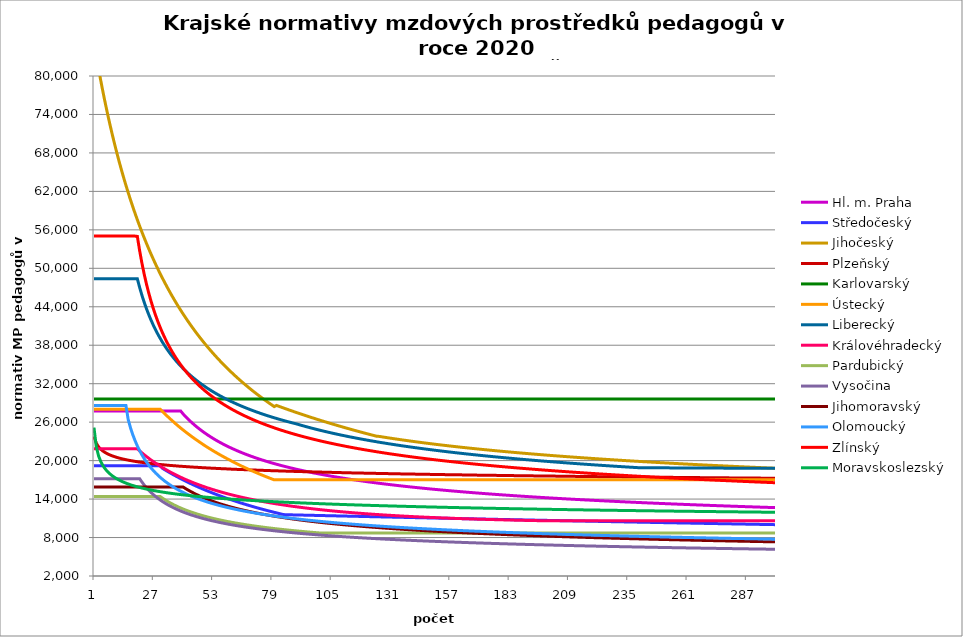
| Category | Hl. m. Praha | Středočeský | Jihočeský | Plzeňský | Karlovarský  | Ústecký   | Liberecký | Královéhradecký | Pardubický | Vysočina | Jihomoravský | Olomoucký | Zlínský | Moravskoslezský |
|---|---|---|---|---|---|---|---|---|---|---|---|---|---|---|
| 0 | 27744.282 | 19215.36 | 85227.218 | 23750.715 | 29600 | 28017.204 | 48369.677 | 21844.533 | 14402.751 | 17187.474 | 15895.855 | 28605.175 | 55022.513 | 25157.647 |
| 1 | 27744.282 | 19215.36 | 83125.411 | 22715.459 | 29600 | 28017.204 | 48369.677 | 21844.533 | 14402.751 | 17187.474 | 15895.855 | 28605.175 | 55022.513 | 22174.645 |
| 2 | 27744.282 | 19215.36 | 81124.775 | 22143.083 | 29600 | 28017.204 | 48369.677 | 21844.533 | 14402.751 | 17187.474 | 15895.855 | 28605.175 | 55022.513 | 20736.363 |
| 3 | 27744.282 | 19215.36 | 79218.177 | 21756.117 | 29600 | 28017.204 | 48369.677 | 21844.533 | 14402.751 | 17187.474 | 15895.855 | 28605.175 | 55022.513 | 19824.06 |
| 4 | 27744.282 | 19215.36 | 77399.139 | 21464.368 | 29600 | 28017.204 | 48369.677 | 21844.533 | 14402.751 | 17187.474 | 15895.855 | 28605.175 | 55022.513 | 19169.879 |
| 5 | 27744.282 | 19215.36 | 75661.764 | 21240.569 | 29600 | 28017.204 | 48369.677 | 21844.533 | 14402.751 | 17187.474 | 15895.855 | 28605.175 | 55022.513 | 18666.583 |
| 6 | 27744.282 | 19215.36 | 74000.675 | 21041.127 | 29600 | 28017.204 | 48369.677 | 21844.533 | 14402.751 | 17187.474 | 15895.855 | 28605.175 | 55022.513 | 18261.223 |
| 7 | 27744.282 | 19215.36 | 72410.955 | 20884.25 | 29600 | 28017.204 | 48369.677 | 21844.533 | 14402.751 | 17187.474 | 15895.855 | 28605.175 | 55022.513 | 17924.051 |
| 8 | 27744.282 | 19215.36 | 70888.1 | 20739.287 | 29600 | 28017.204 | 48369.677 | 21844.533 | 14402.751 | 17187.474 | 15895.855 | 28605.175 | 55022.513 | 17636.814 |
| 9 | 27744.282 | 19215.36 | 69427.98 | 20615.271 | 29600 | 28017.204 | 48369.677 | 21844.533 | 14402.751 | 17187.474 | 15895.855 | 28605.175 | 55022.513 | 17387.563 |
| 10 | 27744.282 | 19215.36 | 68026.795 | 20502.104 | 29600 | 28017.204 | 48369.677 | 21844.533 | 14402.751 | 17187.474 | 15895.855 | 28605.175 | 55022.513 | 17168.08 |
| 11 | 27744.282 | 19215.36 | 66681.049 | 20399.454 | 29600 | 28017.204 | 48369.677 | 21844.533 | 14402.751 | 17187.474 | 15895.855 | 28605.175 | 55022.513 | 16972.491 |
| 12 | 27744.282 | 19215.36 | 65387.514 | 20307.023 | 29600 | 28017.204 | 48369.677 | 21844.533 | 14402.751 | 17187.474 | 15895.855 | 28605.175 | 55022.513 | 16796.461 |
| 13 | 27744.282 | 19215.36 | 64143.211 | 20224.549 | 29600 | 28017.204 | 48369.677 | 21844.533 | 14402.751 | 17187.474 | 15895.855 | 28605.175 | 55022.513 | 16636.707 |
| 14 | 27744.282 | 19215.36 | 62945.38 | 20142.742 | 29600 | 28017.204 | 48369.677 | 21844.533 | 14402.751 | 17187.474 | 15895.855 | 28605.175 | 55022.513 | 16490.687 |
| 15 | 27744.282 | 19215.36 | 61791.467 | 20070.578 | 29600 | 28017.204 | 48369.677 | 21844.533 | 14402.751 | 17187.474 | 15895.855 | 26386.396 | 55022.513 | 16356.396 |
| 16 | 27744.282 | 19215.36 | 60679.099 | 20007.857 | 29600 | 28017.204 | 48369.677 | 21844.533 | 14402.751 | 17187.474 | 15895.855 | 25127.045 | 55022.513 | 16232.226 |
| 17 | 27744.282 | 19215.36 | 59606.073 | 19945.527 | 29600 | 28017.204 | 48369.677 | 21844.533 | 14402.751 | 17187.474 | 15895.855 | 24047.635 | 55022.513 | 16116.87 |
| 18 | 27744.282 | 19215.36 | 58570.337 | 19883.585 | 29600 | 28017.204 | 48369.677 | 21844.533 | 14402.751 | 17187.474 | 15895.855 | 23117.407 | 55022.513 | 16009.252 |
| 19 | 27744.282 | 19215.36 | 57569.981 | 19822.026 | 29600 | 28017.204 | 48369.677 | 21844.533 | 14402.751 | 17187.474 | 15895.855 | 22290.121 | 54979.248 | 15908.475 |
| 20 | 27744.282 | 19215.36 | 56603.222 | 19769.563 | 29600 | 28017.204 | 47024.575 | 21523.604 | 14402.751 | 17187.474 | 15895.855 | 21561.97 | 52770.921 | 15813.786 |
| 21 | 27744.282 | 19215.36 | 55668.396 | 19726.056 | 29600 | 28017.204 | 45809.931 | 21211.969 | 14402.751 | 16666.811 | 15895.855 | 20909.504 | 50824.463 | 15724.547 |
| 22 | 27744.282 | 19215.36 | 54763.947 | 19674.1 | 29600 | 28017.204 | 44706.502 | 20919.181 | 14402.751 | 16198.337 | 15895.855 | 20323.346 | 49094.133 | 15640.211 |
| 23 | 27744.282 | 19215.36 | 53888.417 | 19631.012 | 29600 | 28017.204 | 43698.731 | 20634.366 | 14402.751 | 15773.783 | 15895.855 | 19786.846 | 47544.374 | 15560.309 |
| 24 | 27744.282 | 19215.36 | 53040.442 | 19588.112 | 29600 | 28017.204 | 42773.89 | 20366.636 | 14402.751 | 15386.8 | 15895.855 | 19303.186 | 46147.119 | 15484.432 |
| 25 | 27744.282 | 19215.36 | 52218.74 | 19545.399 | 29600 | 28017.204 | 41921.467 | 20096.571 | 14402.751 | 15032.044 | 15895.855 | 18858.678 | 44879.906 | 15412.226 |
| 26 | 27744.282 | 19215.36 | 51422.109 | 19502.872 | 29600 | 28017.204 | 41132.69 | 19851.491 | 14402.751 | 14705.916 | 15895.855 | 18449.562 | 43724.538 | 15343.377 |
| 27 | 27744.282 | 19215.36 | 50649.419 | 19468.983 | 29600 | 28017.204 | 40400.185 | 19603.568 | 14402.751 | 14405.318 | 15895.855 | 18072.579 | 42666.111 | 15277.613 |
| 28 | 27744.282 | 19215.36 | 49899.607 | 19426.788 | 29600 | 28017.204 | 39717.702 | 19370.295 | 14402.751 | 14125.834 | 15895.855 | 17724.89 | 41692.296 | 15214.688 |
| 29 | 27744.282 | 19215.36 | 49171.672 | 19393.163 | 29600 | 28017.204 | 39079.905 | 19142.509 | 14402.751 | 13866.563 | 15895.855 | 17397.168 | 40792.806 | 15154.387 |
| 30 | 27744.282 | 18801.722 | 48464.669 | 19359.654 | 29600 | 27660.297 | 38482.213 | 18920.017 | 14151.855 | 13624.675 | 15895.855 | 17094.55 | 39958.981 | 15096.517 |
| 31 | 27744.282 | 18583.52 | 47777.709 | 19326.261 | 29600 | 27312.369 | 37920.665 | 18710.6 | 13916.665 | 13398.079 | 15895.855 | 16808.666 | 39183.482 | 15040.904 |
| 32 | 27744.282 | 18370.325 | 47109.952 | 19292.983 | 29600 | 26973.085 | 37391.82 | 18505.768 | 13696.055 | 13185.672 | 15895.855 | 16544.557 | 38460.044 | 14987.392 |
| 33 | 27744.282 | 18161.966 | 46460.602 | 19259.82 | 29600 | 26642.127 | 36892.673 | 18305.373 | 13488.614 | 12985.737 | 15895.855 | 16294.62 | 37783.285 | 14935.84 |
| 34 | 27744.282 | 17958.28 | 45828.911 | 19235.021 | 29600 | 26319.192 | 36420.584 | 18116.735 | 13293.113 | 12797.804 | 15895.855 | 16057.952 | 37148.552 | 14886.121 |
| 35 | 27744.282 | 17759.113 | 45214.166 | 19202.057 | 29600 | 26003.992 | 35973.23 | 17931.946 | 13108.474 | 12620.062 | 15895.855 | 15833.727 | 36551.807 | 14838.118 |
| 36 | 27744.282 | 17564.314 | 44615.695 | 19177.407 | 29600 | 25679.369 | 35548.551 | 17750.889 | 12933.749 | 12451.89 | 15895.855 | 15621.194 | 35989.522 | 14791.728 |
| 37 | 27744.282 | 17373.743 | 44032.86 | 19144.639 | 29600 | 25379.221 | 35144.719 | 17573.451 | 12768.099 | 12292.395 | 15895.855 | 15419.665 | 35458.601 | 14746.852 |
| 38 | 27744.282 | 17187.263 | 43465.057 | 19120.137 | 29600 | 25086.008 | 34760.101 | 17406.416 | 12610.782 | 12141.084 | 15895.855 | 15233.758 | 34956.318 | 14703.402 |
| 39 | 27304.519 | 17004.743 | 42911.711 | 19095.697 | 29600 | 24799.492 | 34393.237 | 17242.526 | 12461.135 | 11996.881 | 15895.855 | 15052.28 | 34480.26 | 14661.299 |
| 40 | 26923.089 | 16826.06 | 42372.277 | 19071.319 | 29600 | 24519.448 | 34042.815 | 17081.695 | 12318.564 | 11859.719 | 15673.769 | 14880.081 | 34028.284 | 14620.467 |
| 41 | 26560.987 | 16651.092 | 41846.236 | 19047.004 | 29600 | 24245.658 | 33707.656 | 16930.354 | 12182.54 | 11728.638 | 15457.802 | 14716.672 | 33598.48 | 14580.837 |
| 42 | 26216.684 | 16479.726 | 41333.097 | 19022.75 | 29600 | 23977.914 | 33386.691 | 16781.672 | 12052.585 | 11603.338 | 15258.075 | 14556.814 | 33189.14 | 14542.347 |
| 43 | 25888.809 | 16311.851 | 40832.39 | 18998.559 | 29600 | 23716.019 | 33078.953 | 16635.579 | 11928.268 | 11483.829 | 15063.444 | 14405.081 | 32798.73 | 14504.938 |
| 44 | 25576.133 | 16147.361 | 40343.669 | 18974.428 | 29600 | 23459.784 | 32783.567 | 16492.008 | 11809.199 | 11369.277 | 14878.647 | 14265.677 | 32425.871 | 14468.555 |
| 45 | 25277.551 | 15986.156 | 39866.509 | 18958.376 | 29600 | 23209.026 | 32499.731 | 16356.978 | 11695.023 | 11259.183 | 14703.145 | 14124.433 | 32069.318 | 14433.147 |
| 46 | 24992.062 | 15828.138 | 39400.504 | 18934.347 | 29600 | 22963.572 | 32226.717 | 16224.142 | 11585.421 | 11153.896 | 14536.443 | 13994.81 | 31727.942 | 14398.669 |
| 47 | 24718.762 | 15673.214 | 38945.267 | 18910.38 | 29600 | 22723.256 | 31963.858 | 16093.446 | 11480.098 | 11052.412 | 14373.479 | 13867.545 | 31400.72 | 14365.075 |
| 48 | 24456.829 | 15521.292 | 38500.43 | 18894.435 | 29600 | 22474.986 | 31710.543 | 15970.64 | 11378.786 | 10954.838 | 14218.631 | 13742.573 | 31086.723 | 14332.326 |
| 49 | 24205.518 | 15372.288 | 38065.64 | 18870.568 | 29600 | 22244.735 | 31466.21 | 15843.98 | 11281.241 | 10860.759 | 14071.496 | 13624.03 | 30785.101 | 14300.383 |
| 50 | 23964.145 | 15226.117 | 37640.561 | 18854.691 | 29600 | 22019.155 | 31230.342 | 15724.937 | 11187.236 | 10770.545 | 13931.698 | 13511.641 | 30495.079 | 14269.211 |
| 51 | 23732.089 | 15082.7 | 37224.87 | 18830.924 | 29600 | 21798.104 | 31002.463 | 15613.215 | 11096.567 | 10683.052 | 13794.651 | 13401.091 | 30215.947 | 14238.775 |
| 52 | 23508.779 | 14941.96 | 36818.261 | 18815.113 | 29600 | 21581.447 | 30782.133 | 15497.602 | 11009.041 | 10598.916 | 13664.434 | 13296.332 | 29947.053 | 14209.045 |
| 53 | 23293.691 | 14803.821 | 36420.438 | 18799.329 | 29600 | 21369.054 | 30568.945 | 15389.076 | 10924.483 | 10517.533 | 13536.652 | 13193.198 | 29687.797 | 14179.992 |
| 54 | 23086.344 | 14668.214 | 36031.121 | 18775.702 | 29600 | 21160.801 | 30362.522 | 15282.058 | 10842.731 | 10438.806 | 13415.247 | 13095.529 | 29437.627 | 14151.586 |
| 55 | 22886.295 | 14535.068 | 35650.039 | 18759.983 | 29600 | 20956.568 | 30162.513 | 15176.519 | 10763.634 | 10362.412 | 13296 | 12999.295 | 29196.035 | 14123.804 |
| 56 | 22693.133 | 14404.318 | 35276.933 | 18744.291 | 29600 | 20756.24 | 29968.593 | 15077.599 | 10687.052 | 10288.733 | 13182.726 | 12908.231 | 28962.549 | 14096.618 |
| 57 | 22506.48 | 14275.899 | 34911.557 | 18728.625 | 29600 | 20559.705 | 29780.46 | 14974.855 | 10612.857 | 10217.451 | 13075.175 | 12818.435 | 28736.733 | 14070.008 |
| 58 | 22325.987 | 14149.75 | 34553.671 | 18712.985 | 29600 | 20366.858 | 29597.83 | 14878.538 | 10540.927 | 10148.265 | 12969.364 | 12729.879 | 28518.183 | 14043.95 |
| 59 | 22151.328 | 14025.81 | 34203.049 | 18689.575 | 29600 | 20177.594 | 29420.441 | 14783.451 | 10471.15 | 10080.891 | 12865.252 | 12646.154 | 28306.522 | 14018.424 |
| 60 | 21982.2 | 13904.023 | 33859.47 | 18674 | 29600 | 19991.816 | 29248.046 | 14694.483 | 10403.422 | 10015.709 | 12766.43 | 12567.093 | 28101.403 | 13993.41 |
| 61 | 21818.324 | 13784.333 | 33522.726 | 18658.451 | 29600 | 19799.392 | 29080.414 | 14606.58 | 10337.645 | 9952.652 | 12672.691 | 12485.488 | 27902.499 | 13968.89 |
| 62 | 21659.438 | 13666.686 | 33192.614 | 18642.928 | 29600 | 19620.482 | 28917.329 | 14514.927 | 10273.727 | 9890.808 | 12576.794 | 12408.418 | 27709.507 | 13944.846 |
| 63 | 21505.297 | 13551.03 | 32868.94 | 18627.431 | 29600 | 19444.776 | 28758.59 | 14433.892 | 10211.582 | 9830.984 | 12489.285 | 12332.292 | 27522.144 | 13921.262 |
| 64 | 21355.675 | 13437.315 | 32551.517 | 18619.693 | 29600 | 19272.189 | 28604.004 | 14349.07 | 10151.132 | 9772.913 | 12399.558 | 12260.493 | 27340.145 | 13898.121 |
| 65 | 21210.358 | 13325.492 | 32240.167 | 18604.234 | 29600 | 19102.639 | 28453.394 | 14265.239 | 10092.299 | 9716.343 | 12314.49 | 12189.526 | 27163.261 | 13875.408 |
| 66 | 21069.147 | 13215.516 | 31934.716 | 18588.801 | 29600 | 18936.047 | 28306.592 | 14186.959 | 10035.015 | 9661.03 | 12230.581 | 12119.375 | 26991.261 | 13853.109 |
| 67 | 20931.854 | 13107.34 | 31634.999 | 18573.394 | 29600 | 18772.334 | 28163.438 | 14109.535 | 9979.211 | 9607.343 | 12151.097 | 12053.312 | 26823.926 | 13831.211 |
| 68 | 20798.305 | 13000.92 | 31340.855 | 18558.012 | 29600 | 18611.429 | 28023.784 | 14032.95 | 9924.826 | 9555.04 | 12072.639 | 11987.964 | 26661.051 | 13809.699 |
| 69 | 20668.334 | 12896.215 | 31052.131 | 18542.656 | 29600 | 18453.258 | 27887.488 | 13961.626 | 9871.8 | 9504.087 | 11998.396 | 11923.322 | 26502.443 | 13788.563 |
| 70 | 20541.788 | 12793.182 | 30768.678 | 18534.988 | 29600 | 18297.753 | 27754.417 | 13886.635 | 9820.078 | 9454.061 | 11921.892 | 11862.554 | 26347.922 | 13767.79 |
| 71 | 20418.519 | 12691.783 | 30490.353 | 18519.669 | 29600 | 18144.847 | 27624.444 | 13816.787 | 9769.608 | 9405.518 | 11849.485 | 11799.253 | 26197.316 | 13747.369 |
| 72 | 20298.391 | 12591.979 | 30217.018 | 18504.377 | 29600 | 17994.475 | 27497.451 | 13747.638 | 9720.339 | 9358.229 | 11781.045 | 11739.74 | 26050.465 | 13727.288 |
| 73 | 20181.275 | 12493.732 | 29948.541 | 18489.109 | 29600 | 17838.43 | 27373.325 | 13683.437 | 9672.225 | 9311.789 | 11710.334 | 11683.91 | 25907.215 | 13707.538 |
| 74 | 20067.047 | 12397.006 | 29684.792 | 18481.485 | 29600 | 17693.074 | 27251.958 | 13615.613 | 9625.222 | 9266.552 | 11643.487 | 11625.552 | 25767.424 | 13688.109 |
| 75 | 19955.593 | 12301.767 | 29425.648 | 18466.255 | 29600 | 17550.067 | 27133.249 | 13552.636 | 9579.286 | 9222.489 | 11580.387 | 11570.801 | 25630.955 | 13668.991 |
| 76 | 19846.803 | 12207.98 | 29170.99 | 18451.05 | 29600 | 17409.354 | 27017.101 | 13490.239 | 9534.379 | 9179.025 | 11515.012 | 11516.562 | 25497.681 | 13650.175 |
| 77 | 19740.574 | 12115.612 | 28920.701 | 18443.457 | 29600 | 17270.879 | 26903.423 | 13428.414 | 9490.463 | 9136.874 | 11453.292 | 11462.83 | 25367.478 | 13631.653 |
| 78 | 19636.808 | 12024.631 | 28674.671 | 18428.289 | 29600 | 17134.59 | 26792.128 | 13367.153 | 9447.501 | 9095.466 | 11392.232 | 11409.598 | 25240.232 | 13613.416 |
| 79 | 19535.412 | 11935.006 | 28432.792 | 18420.715 | 29600 | 17000.435 | 26683.133 | 13306.449 | 9405.459 | 9055.143 | 11334.68 | 11359.774 | 25115.833 | 13595.456 |
| 80 | 19436.298 | 11846.708 | 28610.687 | 18405.585 | 29600 | 17000.435 | 26576.359 | 13250.286 | 9364.305 | 9015.351 | 11274.874 | 11310.384 | 24994.177 | 13577.766 |
| 81 | 19339.383 | 11759.706 | 28479.743 | 18398.03 | 29600 | 17000.435 | 26471.73 | 13194.596 | 9324.008 | 8976.606 | 11218.5 | 11261.421 | 24875.165 | 13560.338 |
| 82 | 19244.587 | 11673.973 | 28349.992 | 18382.937 | 29600 | 17000.435 | 26369.175 | 13139.372 | 9284.539 | 8938.538 | 11162.687 | 11212.88 | 24758.703 | 13543.165 |
| 83 | 19151.834 | 11589.481 | 28221.417 | 18375.4 | 29600 | 17000.435 | 26268.627 | 13084.609 | 9245.869 | 8901.479 | 11110.176 | 11167.576 | 24644.703 | 13526.241 |
| 84 | 19061.053 | 11561.588 | 28094.004 | 18360.344 | 29600 | 17000.435 | 26170.018 | 13030.299 | 9207.972 | 8864.896 | 11055.432 | 11122.636 | 24533.078 | 13509.558 |
| 85 | 18972.176 | 11553.247 | 27967.736 | 18352.826 | 29600 | 17000.435 | 26073.287 | 12980.272 | 9170.823 | 8829.119 | 11003.923 | 11078.056 | 24423.747 | 13493.111 |
| 86 | 18885.137 | 11544.917 | 27842.598 | 18337.807 | 29600 | 17000.435 | 25978.375 | 12926.824 | 9134.396 | 8793.965 | 10952.892 | 11033.832 | 24316.634 | 13476.893 |
| 87 | 18799.874 | 11536.599 | 27718.574 | 18330.307 | 29600 | 17000.435 | 25885.225 | 12877.586 | 9098.669 | 8759.588 | 10902.332 | 10989.96 | 24211.665 | 13460.899 |
| 88 | 18716.328 | 11528.294 | 27595.651 | 18315.325 | 29600 | 17000.435 | 25793.781 | 12828.722 | 9063.619 | 8725.974 | 10854.862 | 10946.436 | 24108.769 | 13445.123 |
| 89 | 18634.443 | 11520 | 27473.813 | 18307.843 | 29600 | 17000.435 | 25703.992 | 12783.944 | 9029.225 | 8692.944 | 10807.803 | 10905.943 | 24007.879 | 13429.559 |
| 90 | 18554.163 | 11511.718 | 27353.047 | 18300.367 | 29600 | 17000.435 | 25599.973 | 12735.787 | 8995.468 | 8660.163 | 10758.571 | 10865.749 | 23908.931 | 13414.203 |
| 91 | 18475.439 | 11503.448 | 27233.337 | 18285.435 | 29600 | 17000.435 | 25497.915 | 12691.655 | 8962.326 | 8628.273 | 10714.9 | 10825.851 | 23811.863 | 13399.049 |
| 92 | 18398.221 | 11495.19 | 27114.671 | 18277.977 | 29600 | 17000.435 | 25397.758 | 12644.189 | 8929.782 | 8597.098 | 10669.044 | 10786.244 | 23716.617 | 13384.093 |
| 93 | 18322.461 | 11486.944 | 26997.034 | 18270.526 | 29600 | 17000.435 | 25299.443 | 12600.688 | 8897.818 | 8566.307 | 10623.58 | 10746.926 | 23623.137 | 13369.329 |
| 94 | 18248.114 | 11478.71 | 26880.413 | 18255.642 | 29600 | 17000.435 | 25202.915 | 12557.486 | 8866.417 | 8536.05 | 10580.995 | 10707.893 | 23531.368 | 13354.754 |
| 95 | 18175.137 | 11470.487 | 26764.796 | 18248.208 | 29600 | 17000.435 | 25108.12 | 12518.143 | 8835.562 | 8506.477 | 10538.751 | 10671.718 | 23441.26 | 13340.362 |
| 96 | 18103.489 | 11462.276 | 26650.169 | 18240.781 | 29600 | 17000.435 | 25015.007 | 12475.504 | 8805.237 | 8477.264 | 10496.842 | 10635.786 | 23352.762 | 13326.15 |
| 97 | 18033.13 | 11454.077 | 26536.52 | 18225.946 | 29600 | 17000.435 | 24923.526 | 12436.672 | 8775.428 | 8448.406 | 10455.266 | 10600.096 | 23265.827 | 13312.114 |
| 98 | 17964.021 | 11445.89 | 26423.836 | 18218.537 | 29600 | 17000.435 | 24833.631 | 12394.585 | 8746.119 | 8420.204 | 10414.017 | 10564.644 | 23180.41 | 13298.249 |
| 99 | 17896.127 | 11437.714 | 26312.105 | 18211.134 | 29600 | 17000.435 | 24745.275 | 12356.255 | 8717.297 | 8392.495 | 10375.491 | 10529.429 | 23096.467 | 13284.552 |
| 100 | 17829.412 | 11429.55 | 26201.315 | 18203.737 | 29600 | 17000.435 | 24658.416 | 12318.161 | 8717.297 | 8365.119 | 10337.249 | 10494.447 | 23013.956 | 13271.02 |
| 101 | 17763.843 | 11421.398 | 26091.454 | 18188.961 | 29600 | 17000.435 | 24573.012 | 12280.302 | 8717.297 | 8338.373 | 10296.925 | 10462.172 | 22932.836 | 13257.647 |
| 102 | 17699.387 | 11413.257 | 25982.51 | 18181.582 | 29600 | 17000.435 | 24489.022 | 12246.085 | 8717.297 | 8311.947 | 10259.259 | 10427.635 | 22853.07 | 13244.432 |
| 103 | 17636.013 | 11405.128 | 25874.472 | 18174.209 | 29600 | 17000.435 | 24406.407 | 12208.667 | 8717.297 | 8285.837 | 10224.197 | 10395.769 | 22774.619 | 13231.37 |
| 104 | 17573.692 | 11397.011 | 25767.33 | 18166.842 | 29600 | 17000.435 | 24325.13 | 12174.848 | 8717.297 | 8260.334 | 10187.06 | 10364.097 | 22697.449 | 13218.459 |
| 105 | 17512.393 | 11388.905 | 25661.07 | 18159.481 | 29600 | 17000.435 | 24245.156 | 12137.862 | 8717.297 | 8235.135 | 10150.192 | 10332.617 | 22621.523 | 13205.694 |
| 106 | 17452.091 | 11380.81 | 25555.684 | 18144.777 | 29600 | 17000.435 | 24166.449 | 12104.434 | 8717.297 | 8210.38 | 10115.87 | 10301.328 | 22546.81 | 13193.074 |
| 107 | 17392.758 | 11372.727 | 25451.159 | 18137.434 | 29600 | 17000.435 | 24088.977 | 12071.189 | 8717.297 | 8185.919 | 10081.779 | 10270.228 | 22473.277 | 13180.595 |
| 108 | 17334.368 | 11364.656 | 25347.487 | 18130.097 | 29600 | 17000.435 | 24012.707 | 12038.127 | 8717.297 | 8161.748 | 10047.918 | 10239.315 | 22400.893 | 13168.255 |
| 109 | 17276.896 | 11356.596 | 25244.655 | 18122.766 | 29600 | 17000.435 | 23937.609 | 12008.525 | 8717.297 | 8138.293 | 10014.283 | 10210.944 | 22329.628 | 13156.05 |
| 110 | 17220.32 | 11348.547 | 25142.654 | 18115.441 | 29600 | 17000.435 | 23863.652 | 11975.804 | 8717.297 | 8114.83 | 9980.872 | 10180.387 | 22259.454 | 13143.977 |
| 111 | 17164.615 | 11340.51 | 25041.475 | 18108.121 | 29600 | 17000.435 | 23790.808 | 11946.507 | 8717.297 | 8091.786 | 9947.683 | 10152.342 | 22190.344 | 13132.035 |
| 112 | 17109.76 | 11332.484 | 24941.106 | 18100.808 | 29600 | 17000.435 | 23719.049 | 11914.123 | 8717.297 | 8069.013 | 9914.715 | 10124.451 | 22122.27 | 13120.22 |
| 113 | 17055.733 | 11324.47 | 24841.539 | 18086.199 | 29600 | 17000.435 | 23648.348 | 11885.127 | 8717.297 | 8046.788 | 9884.141 | 10094.408 | 22055.206 | 13108.53 |
| 114 | 17002.514 | 11316.466 | 24742.763 | 18078.903 | 29600 | 17000.435 | 23578.679 | 11856.272 | 8717.297 | 8024.825 | 9853.755 | 10066.834 | 21989.129 | 13096.963 |
| 115 | 16950.082 | 11308.475 | 24644.77 | 18071.613 | 29600 | 17000.435 | 23510.018 | 11827.557 | 8717.297 | 8002.982 | 9821.405 | 10039.41 | 21924.013 | 13085.516 |
| 116 | 16898.419 | 11300.494 | 24547.55 | 18064.329 | 29600 | 17000.435 | 23442.34 | 11798.98 | 8717.297 | 7981.533 | 9791.403 | 10014.402 | 21859.836 | 13074.188 |
| 117 | 16847.505 | 11292.525 | 24451.094 | 18057.051 | 29600 | 17000.435 | 23375.621 | 11773.694 | 8717.297 | 7960.474 | 9761.584 | 9987.263 | 21796.574 | 13062.975 |
| 118 | 16797.323 | 11284.567 | 24355.393 | 18049.778 | 29600 | 17000.435 | 23309.839 | 11745.377 | 8717.297 | 7939.662 | 9734.056 | 9960.27 | 21734.208 | 13051.875 |
| 119 | 16747.855 | 11276.62 | 24260.438 | 18042.512 | 29600 | 17000.435 | 23244.972 | 11720.32 | 8717.297 | 7919.094 | 9704.585 | 9935.655 | 21672.714 | 13040.887 |
| 120 | 16699.085 | 11268.684 | 24166.221 | 18035.252 | 29600 | 17000.435 | 23180.999 | 11692.259 | 8717.297 | 7898.768 | 9675.291 | 9908.94 | 21612.074 | 13030.009 |
| 121 | 16650.996 | 11260.759 | 24072.733 | 18027.997 | 29600 | 17000.435 | 23117.899 | 11667.428 | 8717.297 | 7878.815 | 9648.248 | 9884.578 | 21552.266 | 13019.238 |
| 122 | 16603.572 | 11252.846 | 23979.966 | 18020.748 | 29600 | 17000.435 | 23055.653 | 11642.702 | 8717.297 | 7858.962 | 9619.293 | 9860.334 | 21493.274 | 13008.572 |
| 123 | 16556.798 | 11244.944 | 23887.91 | 18013.505 | 29600 | 17000.435 | 22994.242 | 11618.081 | 8717.297 | 7839.476 | 9592.561 | 9836.21 | 21435.077 | 12998.01 |
| 124 | 16510.66 | 11237.053 | 23796.559 | 18006.268 | 29600 | 17000.435 | 22933.645 | 11593.564 | 8717.297 | 7820.35 | 9565.977 | 9812.203 | 21377.658 | 12987.55 |
| 125 | 16465.142 | 11229.173 | 23777.775 | 17999.036 | 29600 | 17000.435 | 22873.847 | 11572.196 | 8717.297 | 7801.318 | 9539.541 | 9788.313 | 21320.999 | 12977.19 |
| 126 | 16420.232 | 11221.303 | 23720.622 | 17991.811 | 29600 | 17000.435 | 22814.828 | 11547.872 | 8717.297 | 7782.641 | 9513.25 | 9764.54 | 21265.085 | 12966.928 |
| 127 | 16375.916 | 11213.445 | 23664.188 | 17984.591 | 29600 | 17000.435 | 22756.573 | 11523.65 | 8717.297 | 7764.053 | 9487.104 | 9740.881 | 21209.898 | 12956.763 |
| 128 | 16332.18 | 11205.598 | 23608.458 | 17977.377 | 29600 | 17000.435 | 22699.064 | 11502.539 | 8717.297 | 7745.683 | 9461.101 | 9717.337 | 21155.423 | 12946.692 |
| 129 | 16289.012 | 11197.762 | 23553.417 | 17970.168 | 29600 | 17000.435 | 22642.286 | 11481.505 | 8717.297 | 7727.789 | 9437.224 | 9696.032 | 21101.645 | 12936.715 |
| 130 | 16246.4 | 11189.937 | 23499.051 | 17962.966 | 29600 | 17000.435 | 22586.223 | 11460.548 | 8717.297 | 7709.848 | 9411.493 | 9672.703 | 21048.548 | 12926.829 |
| 131 | 16204.332 | 11182.123 | 23445.346 | 17955.769 | 29600 | 17000.435 | 22530.861 | 11436.69 | 8717.297 | 7692.246 | 9387.866 | 9651.593 | 20996.118 | 12917.033 |
| 132 | 16162.796 | 11174.32 | 23392.289 | 17948.578 | 29600 | 17000.435 | 22476.184 | 11418.862 | 8717.297 | 7674.852 | 9362.404 | 9628.478 | 20944.342 | 12907.326 |
| 133 | 16121.781 | 11166.527 | 23339.865 | 17941.393 | 29600 | 17000.435 | 22422.178 | 11398.133 | 8717.297 | 7657.664 | 9339.022 | 9607.56 | 20893.206 | 12897.706 |
| 134 | 16081.277 | 11158.746 | 23288.064 | 17934.214 | 29600 | 17000.435 | 22368.829 | 11377.479 | 8717.297 | 7640.679 | 9315.757 | 9586.733 | 20842.696 | 12888.172 |
| 135 | 16041.272 | 11150.975 | 23236.871 | 17927.04 | 29600 | 17000.435 | 22316.125 | 11356.899 | 8717.297 | 7623.895 | 9292.607 | 9563.927 | 20792.8 | 12878.722 |
| 136 | 16001.757 | 11143.215 | 23186.276 | 17927.04 | 29600 | 17000.435 | 22264.052 | 11339.319 | 8717.297 | 7607.311 | 9269.572 | 9543.289 | 20743.505 | 12869.355 |
| 137 | 15962.722 | 11135.466 | 23136.266 | 17919.872 | 29600 | 17000.435 | 22212.598 | 11318.877 | 8717.297 | 7590.923 | 9246.652 | 9522.739 | 20694.799 | 12860.07 |
| 138 | 15924.156 | 11127.728 | 23086.831 | 17912.71 | 29600 | 17000.435 | 22161.75 | 11301.414 | 8717.297 | 7574.605 | 9223.844 | 9502.278 | 20646.671 | 12850.865 |
| 139 | 15886.05 | 11120 | 23037.958 | 17905.553 | 29600 | 17000.435 | 22111.496 | 11281.109 | 8717.297 | 7558.605 | 9201.148 | 9481.904 | 20599.108 | 12841.738 |
| 140 | 15848.396 | 11112.283 | 22989.637 | 17898.403 | 29600 | 17000.435 | 22061.825 | 11263.762 | 8717.297 | 7542.672 | 9180.442 | 9463.642 | 20552.101 | 12832.69 |
| 141 | 15811.184 | 11104.577 | 22941.858 | 17891.257 | 29600 | 17000.435 | 22012.725 | 11246.469 | 8717.297 | 7527.052 | 9157.959 | 9443.434 | 20505.637 | 12823.718 |
| 142 | 15774.405 | 11096.881 | 22894.61 | 17884.118 | 29600 | 17000.435 | 21964.185 | 11229.228 | 8717.297 | 7511.497 | 9135.586 | 9423.311 | 20459.707 | 12814.822 |
| 143 | 15738.052 | 11089.197 | 22847.884 | 17876.984 | 29600 | 17000.435 | 21916.195 | 11212.041 | 8717.297 | 7496.249 | 9115.174 | 9405.274 | 20414.3 | 12806 |
| 144 | 15702.116 | 11081.522 | 22801.67 | 17869.856 | 29600 | 17000.435 | 21868.745 | 11194.906 | 8717.297 | 7481.063 | 9094.852 | 9385.314 | 20369.407 | 12797.251 |
| 145 | 15666.589 | 11073.859 | 22755.958 | 17869.856 | 29600 | 17000.435 | 21821.823 | 11177.823 | 8717.297 | 7466.059 | 9072.786 | 9367.422 | 20325.017 | 12788.573 |
| 146 | 15631.463 | 11066.206 | 22710.738 | 17862.734 | 29600 | 17000.435 | 21775.421 | 11163.627 | 8717.297 | 7451.235 | 9052.653 | 9347.622 | 20281.121 | 12779.967 |
| 147 | 15596.731 | 11058.564 | 22666.003 | 17855.618 | 29600 | 17000.435 | 21729.528 | 11146.64 | 8717.297 | 7436.59 | 9032.609 | 9329.873 | 20237.71 | 12771.431 |
| 148 | 15562.385 | 11050.932 | 22621.744 | 17848.507 | 29600 | 17000.435 | 21684.135 | 11132.523 | 8717.297 | 7422.002 | 9012.653 | 9312.192 | 20194.774 | 12762.963 |
| 149 | 15528.418 | 11043.31 | 22577.951 | 17841.401 | 29600 | 17000.435 | 21639.233 | 11115.63 | 8717.297 | 7407.709 | 8992.786 | 9292.625 | 20152.306 | 12754.563 |
| 150 | 15494.824 | 11035.7 | 22534.617 | 17834.302 | 29600 | 17000.435 | 21594.813 | 11101.591 | 8717.297 | 7393.472 | 8973.005 | 9275.084 | 20110.297 | 12746.23 |
| 151 | 15461.595 | 11028.099 | 22491.733 | 17834.302 | 29600 | 17000.435 | 21550.867 | 11084.792 | 8717.297 | 7379.288 | 8953.312 | 9257.609 | 20068.738 | 12737.962 |
| 152 | 15428.725 | 11020.509 | 22449.292 | 17827.208 | 29600 | 17000.435 | 21507.385 | 11070.831 | 8717.297 | 7365.512 | 8935.484 | 9240.201 | 20027.621 | 12729.76 |
| 153 | 15396.206 | 11012.93 | 22407.285 | 17820.119 | 29600 | 17000.435 | 21464.361 | 11056.906 | 8717.297 | 7351.67 | 8915.955 | 9222.857 | 19986.939 | 12721.621 |
| 154 | 15364.034 | 11005.361 | 22365.706 | 17813.037 | 29600 | 17000.435 | 21421.784 | 11043.015 | 8717.297 | 7337.996 | 8896.511 | 9205.579 | 19946.683 | 12713.545 |
| 155 | 15332.202 | 10997.802 | 22324.547 | 17805.959 | 29600 | 17000.435 | 21379.649 | 11029.159 | 8717.297 | 7324.606 | 8878.908 | 9188.365 | 19906.847 | 12705.531 |
| 156 | 15300.703 | 10990.254 | 22283.8 | 17805.959 | 29600 | 17000.435 | 21337.947 | 11015.338 | 8717.297 | 7311.149 | 8859.625 | 9173.118 | 19867.422 | 12697.579 |
| 157 | 15269.532 | 10982.716 | 22243.459 | 17798.888 | 29600 | 17000.435 | 21296.67 | 11001.552 | 8717.297 | 7297.972 | 8842.167 | 9156.025 | 19828.402 | 12689.687 |
| 158 | 15238.684 | 10975.188 | 22203.517 | 17791.822 | 29600 | 17000.435 | 21255.812 | 10990.548 | 8717.297 | 7284.727 | 8824.779 | 9138.996 | 19789.78 | 12681.854 |
| 159 | 15208.152 | 10967.671 | 22163.968 | 17784.762 | 29600 | 17000.435 | 21215.364 | 10976.823 | 8717.297 | 7271.874 | 8805.73 | 9123.912 | 19751.548 | 12674.08 |
| 160 | 15177.931 | 10960.164 | 22124.804 | 17777.707 | 29600 | 17000.435 | 21175.321 | 10963.133 | 8717.297 | 7258.952 | 8788.484 | 9107.002 | 19713.701 | 12666.364 |
| 161 | 15148.017 | 10952.668 | 22086.02 | 17777.707 | 29600 | 17000.435 | 21135.676 | 10952.205 | 8717.297 | 7246.303 | 8771.306 | 9090.154 | 19676.232 | 12658.705 |
| 162 | 15118.403 | 10945.181 | 22047.608 | 17770.658 | 29600 | 17000.435 | 21096.421 | 10938.576 | 8717.297 | 7233.698 | 8754.194 | 9075.231 | 19639.134 | 12651.103 |
| 163 | 15089.084 | 10937.705 | 22009.564 | 17763.615 | 29600 | 17000.435 | 21057.551 | 10927.698 | 8717.297 | 7221.251 | 8737.15 | 9060.356 | 19602.401 | 12643.555 |
| 164 | 15060.056 | 10930.239 | 21971.881 | 17756.577 | 29600 | 17000.435 | 21019.058 | 10916.841 | 8717.297 | 7208.845 | 8720.171 | 9043.681 | 19566.027 | 12636.063 |
| 165 | 15031.315 | 10922.783 | 21934.554 | 17756.577 | 29600 | 17000.435 | 20980.937 | 10903.299 | 8717.297 | 7196.595 | 8703.258 | 9028.91 | 19530.007 | 12628.625 |
| 166 | 15002.854 | 10915.337 | 21897.576 | 17749.545 | 29600 | 17000.435 | 20943.182 | 10892.491 | 8717.297 | 7184.386 | 8686.411 | 9014.187 | 19494.335 | 12621.24 |
| 167 | 14974.67 | 10907.902 | 21860.942 | 17742.518 | 29600 | 17000.435 | 20905.787 | 10881.703 | 8717.297 | 7172.442 | 8669.629 | 8997.681 | 19459.004 | 12613.908 |
| 168 | 14946.757 | 10900.477 | 21824.647 | 17735.497 | 29600 | 17000.435 | 20868.746 | 10870.937 | 8717.297 | 7160.426 | 8654.581 | 8983.059 | 19424.009 | 12606.627 |
| 169 | 14919.113 | 10893.061 | 21788.685 | 17735.497 | 29600 | 17000.435 | 20832.053 | 10860.193 | 8717.297 | 7148.782 | 8637.921 | 8968.485 | 19389.346 | 12599.398 |
| 170 | 14891.731 | 10885.656 | 21753.051 | 17728.481 | 29600 | 17000.435 | 20795.704 | 10849.469 | 8717.297 | 7136.955 | 8621.326 | 8953.958 | 19355.008 | 12592.22 |
| 171 | 14864.609 | 10878.261 | 21717.741 | 17721.471 | 29600 | 17000.435 | 20759.691 | 10838.767 | 8717.297 | 7125.498 | 8606.444 | 8939.478 | 19320.991 | 12585.091 |
| 172 | 14837.742 | 10870.876 | 21682.748 | 17714.466 | 29600 | 17000.435 | 20724.011 | 10828.086 | 8717.297 | 7113.967 | 8589.969 | 8925.045 | 19287.29 | 12578.012 |
| 173 | 14811.126 | 10863.501 | 21648.069 | 17714.466 | 29600 | 17000.435 | 20688.658 | 10817.426 | 8717.297 | 7102.583 | 8575.196 | 8910.659 | 19253.899 | 12570.982 |
| 174 | 14784.757 | 10856.136 | 21613.699 | 17707.467 | 29600 | 17000.435 | 20653.627 | 10806.786 | 8717.297 | 7091.236 | 8558.84 | 8896.319 | 19220.813 | 12563.999 |
| 175 | 14758.631 | 10848.78 | 21579.632 | 17700.474 | 29600 | 17000.435 | 20618.913 | 10798.821 | 8717.297 | 7080.142 | 8544.174 | 8882.025 | 19188.029 | 12557.064 |
| 176 | 14732.744 | 10841.435 | 21545.865 | 17700.474 | 29600 | 17000.435 | 20584.511 | 10788.218 | 8717.297 | 7069.082 | 8529.557 | 8869.555 | 19155.542 | 12550.176 |
| 177 | 14707.093 | 10834.1 | 21512.393 | 17693.486 | 29600 | 17000.435 | 20550.416 | 10777.636 | 8717.297 | 7058.057 | 8513.375 | 8855.346 | 19123.346 | 12543.334 |
| 178 | 14681.675 | 10826.775 | 21479.211 | 17686.504 | 29600 | 17000.435 | 20516.625 | 10769.713 | 8717.297 | 7047.174 | 8498.864 | 8841.184 | 19091.438 | 12536.538 |
| 179 | 14656.484 | 10819.459 | 21446.315 | 17686.504 | 29600 | 17000.435 | 20483.131 | 10759.168 | 8717.297 | 7036.325 | 8484.402 | 8827.066 | 19059.813 | 12529.788 |
| 180 | 14631.519 | 10812.154 | 21413.701 | 17679.527 | 29600 | 17000.435 | 20449.932 | 10751.272 | 8717.297 | 7025.722 | 8469.989 | 8814.75 | 19028.466 | 12523.081 |
| 181 | 14606.776 | 10804.858 | 21381.366 | 17672.555 | 29600 | 17000.435 | 20417.022 | 10743.388 | 8717.297 | 7015.045 | 8455.625 | 8800.716 | 18997.395 | 12516.419 |
| 182 | 14582.251 | 10797.572 | 21349.304 | 17665.589 | 29600 | 17000.435 | 20384.397 | 10732.894 | 8717.297 | 7004.507 | 8441.309 | 8788.474 | 18966.594 | 12509.8 |
| 183 | 14557.942 | 10790.296 | 21317.512 | 17665.589 | 29600 | 17000.435 | 20352.053 | 10725.037 | 8717.297 | 6994.106 | 8427.042 | 8774.524 | 18936.061 | 12503.225 |
| 184 | 14533.844 | 10783.03 | 21285.986 | 17658.629 | 29600 | 17000.435 | 20319.986 | 10717.191 | 8717.297 | 6983.736 | 8412.823 | 8762.354 | 18905.79 | 12496.692 |
| 185 | 14509.956 | 10775.774 | 21254.722 | 17651.674 | 29600 | 17000.435 | 20288.192 | 10709.357 | 8717.297 | 6973.502 | 8398.652 | 8748.487 | 18875.778 | 12490.201 |
| 186 | 14486.273 | 10768.527 | 21223.717 | 17651.674 | 29600 | 17000.435 | 20256.668 | 10698.929 | 8717.297 | 6963.403 | 8386.096 | 8736.389 | 18846.021 | 12483.751 |
| 187 | 14462.793 | 10761.29 | 21192.968 | 17644.724 | 29600 | 17000.435 | 20225.408 | 10691.121 | 8717.297 | 6953.334 | 8372.015 | 8722.604 | 18816.516 | 12477.342 |
| 188 | 14439.513 | 10754.063 | 21162.469 | 17637.78 | 29600 | 17000.435 | 20194.41 | 10683.325 | 8717.297 | 6943.293 | 8357.981 | 8710.577 | 18787.259 | 12470.974 |
| 189 | 14416.43 | 10746.846 | 21132.218 | 17637.78 | 29600 | 17000.435 | 20163.669 | 10675.54 | 8717.297 | 6933.281 | 8345.546 | 8698.584 | 18758.246 | 12464.646 |
| 190 | 14393.541 | 10739.638 | 21102.212 | 17630.842 | 29600 | 17000.435 | 20133.183 | 10667.767 | 8717.297 | 6923.506 | 8331.6 | 8686.623 | 18729.475 | 12458.357 |
| 191 | 14370.844 | 10732.44 | 21072.447 | 17623.909 | 29600 | 17000.435 | 20102.947 | 10660.005 | 8717.297 | 6913.655 | 8317.702 | 8672.995 | 18700.941 | 12452.108 |
| 192 | 14348.336 | 10725.251 | 21042.92 | 17623.909 | 29600 | 17000.435 | 20072.958 | 10652.254 | 8717.297 | 6904.038 | 8305.386 | 8661.105 | 18672.642 | 12445.897 |
| 193 | 14326.014 | 10718.072 | 21013.627 | 17616.981 | 29600 | 17000.435 | 20043.212 | 10647.093 | 8717.297 | 6894.345 | 8291.574 | 8649.247 | 18644.574 | 12439.725 |
| 194 | 14303.875 | 10710.903 | 20984.566 | 17616.981 | 29600 | 17000.435 | 20013.707 | 10639.361 | 8717.297 | 6884.885 | 8279.336 | 8637.422 | 18616.733 | 12433.59 |
| 195 | 14281.918 | 10703.743 | 20955.733 | 17610.059 | 29600 | 17000.435 | 19984.439 | 10631.64 | 8717.297 | 6875.348 | 8267.133 | 8625.629 | 18589.118 | 12427.493 |
| 196 | 14260.139 | 10696.593 | 20927.125 | 17603.142 | 29600 | 17000.435 | 19955.405 | 10623.93 | 8717.297 | 6866.042 | 8253.449 | 8613.868 | 18561.724 | 12421.433 |
| 197 | 14238.536 | 10689.453 | 20898.74 | 17603.142 | 29600 | 17000.435 | 19926.601 | 10618.797 | 8717.297 | 6856.761 | 8241.322 | 8602.14 | 18534.549 | 12415.409 |
| 198 | 14217.107 | 10682.322 | 20870.574 | 17596.231 | 29600 | 17000.435 | 19898.025 | 10611.106 | 8717.297 | 6847.505 | 8229.232 | 8590.443 | 18507.589 | 12409.421 |
| 199 | 14195.849 | 10675.2 | 20842.624 | 17589.325 | 29600 | 17000.435 | 19869.674 | 10603.426 | 8717.297 | 6838.274 | 8215.672 | 8578.778 | 18480.843 | 12403.469 |
| 200 | 14174.76 | 10668.088 | 20814.888 | 17589.325 | 29600 | 17000.435 | 19841.543 | 10603.426 | 8717.297 | 6829.169 | 8203.656 | 8567.145 | 18454.306 | 12397.553 |
| 201 | 14153.838 | 10660.985 | 20787.363 | 17582.424 | 29600 | 17000.435 | 19813.632 | 10603.426 | 8717.297 | 6820.189 | 8191.676 | 8557.198 | 18427.977 | 12391.671 |
| 202 | 14133.08 | 10653.892 | 20760.046 | 17582.424 | 29600 | 17000.435 | 19785.936 | 10603.426 | 8717.297 | 6811.232 | 8179.73 | 8545.623 | 18401.852 | 12385.824 |
| 203 | 14112.485 | 10646.809 | 20732.934 | 17575.529 | 29600 | 17000.435 | 19758.453 | 10603.426 | 8717.297 | 6802.299 | 8167.819 | 8534.08 | 18375.929 | 12380.012 |
| 204 | 14092.05 | 10639.734 | 20706.025 | 17568.64 | 29600 | 17000.435 | 19731.18 | 10603.426 | 8717.297 | 6793.489 | 8155.943 | 8522.567 | 18350.205 | 12374.233 |
| 205 | 14071.773 | 10632.669 | 20679.316 | 17568.64 | 29600 | 17000.435 | 19704.114 | 10603.426 | 8717.297 | 6784.702 | 8144.102 | 8512.724 | 18324.678 | 12368.487 |
| 206 | 14051.653 | 10625.614 | 20652.805 | 17561.755 | 29600 | 17000.435 | 19677.253 | 10603.426 | 8717.297 | 6776.037 | 8132.294 | 8501.269 | 18299.345 | 12362.775 |
| 207 | 14031.686 | 10618.568 | 20626.489 | 17554.877 | 29600 | 17000.435 | 19650.594 | 10603.426 | 8717.297 | 6767.395 | 8120.521 | 8489.844 | 18274.203 | 12357.095 |
| 208 | 14011.871 | 10611.531 | 20600.366 | 17554.877 | 29600 | 17000.435 | 19624.135 | 10603.426 | 8717.297 | 6758.774 | 8108.782 | 8480.077 | 18249.251 | 12351.448 |
| 209 | 13992.206 | 10604.503 | 20574.433 | 17548.003 | 29600 | 17000.435 | 19597.872 | 10603.426 | 8717.297 | 6750.274 | 8097.077 | 8468.709 | 18224.485 | 12345.833 |
| 210 | 13972.69 | 10597.485 | 20548.688 | 17548.003 | 29600 | 17000.435 | 19571.804 | 10603.426 | 8717.297 | 6741.894 | 8086.862 | 8458.99 | 18199.903 | 12340.25 |
| 211 | 13953.319 | 10590.476 | 20523.129 | 17541.135 | 29600 | 17000.435 | 19545.928 | 10603.426 | 8717.297 | 6733.535 | 8075.22 | 8447.679 | 18175.503 | 12334.698 |
| 212 | 13934.094 | 10583.477 | 20497.753 | 17541.135 | 29600 | 17000.435 | 19520.242 | 10603.426 | 8717.297 | 6725.196 | 8063.612 | 8438.008 | 18151.283 | 12329.177 |
| 213 | 13915.01 | 10576.486 | 20472.558 | 17534.272 | 29600 | 17000.435 | 19494.743 | 10603.426 | 8717.297 | 6716.878 | 8052.037 | 8426.753 | 18127.241 | 12323.687 |
| 214 | 13896.068 | 10569.505 | 20447.542 | 17527.415 | 29600 | 17000.435 | 19469.428 | 10603.426 | 8717.297 | 6708.678 | 8041.935 | 8417.13 | 18103.374 | 12318.227 |
| 215 | 13877.264 | 10562.533 | 20422.703 | 17527.415 | 29600 | 17000.435 | 19444.297 | 10603.426 | 8717.297 | 6700.498 | 8030.422 | 8405.93 | 18079.68 | 12312.798 |
| 216 | 13858.598 | 10555.57 | 20398.038 | 17520.563 | 29600 | 17000.435 | 19419.346 | 10603.426 | 8717.297 | 6692.532 | 8020.375 | 8396.355 | 18056.156 | 12307.398 |
| 217 | 13840.068 | 10548.617 | 20373.546 | 17520.563 | 29600 | 17000.435 | 19394.573 | 10603.426 | 8717.297 | 6684.391 | 8008.924 | 8386.801 | 18032.802 | 12302.028 |
| 218 | 13821.671 | 10541.672 | 20349.224 | 17513.716 | 29600 | 17000.435 | 19369.976 | 10603.426 | 8717.297 | 6676.463 | 7998.93 | 8375.682 | 18009.614 | 12296.687 |
| 219 | 13803.407 | 10534.737 | 20325.071 | 17506.875 | 29600 | 17000.435 | 19345.553 | 10603.426 | 8717.297 | 6668.458 | 7987.54 | 8366.175 | 17986.592 | 12291.375 |
| 220 | 13785.273 | 10527.811 | 20301.084 | 17506.875 | 29600 | 17000.435 | 19321.302 | 10603.426 | 8717.297 | 6660.664 | 7977.6 | 8356.689 | 17963.732 | 12286.092 |
| 221 | 13767.269 | 10520.894 | 20277.261 | 17500.039 | 29600 | 17000.435 | 19297.221 | 10603.426 | 8717.297 | 6652.792 | 7966.27 | 8347.225 | 17941.033 | 12280.837 |
| 222 | 13749.392 | 10513.986 | 20253.601 | 17500.039 | 29600 | 17000.435 | 19273.308 | 10603.426 | 8717.297 | 6645.035 | 7956.383 | 8336.211 | 17918.493 | 12275.61 |
| 223 | 13731.641 | 10507.087 | 20230.102 | 17493.208 | 29600 | 17000.435 | 19249.56 | 10603.426 | 8717.297 | 6637.391 | 7946.52 | 8326.793 | 17896.109 | 12270.411 |
| 224 | 13714.015 | 10500.197 | 20206.762 | 17493.208 | 29600 | 17000.435 | 19225.976 | 10603.426 | 8717.297 | 6629.67 | 7935.279 | 8317.397 | 17873.881 | 12265.239 |
| 225 | 13696.512 | 10493.316 | 20183.578 | 17486.383 | 29600 | 17000.435 | 19202.554 | 10603.426 | 8717.297 | 6622.061 | 7925.468 | 8308.022 | 17851.807 | 12260.095 |
| 226 | 13679.13 | 10486.444 | 20160.55 | 17486.383 | 29600 | 17000.435 | 19179.293 | 10603.426 | 8717.297 | 6614.565 | 7915.682 | 8298.668 | 17829.884 | 12254.977 |
| 227 | 13661.869 | 10479.581 | 20137.674 | 17479.563 | 29600 | 17000.435 | 19156.189 | 10603.426 | 8717.297 | 6607.085 | 7905.92 | 8289.335 | 17808.111 | 12249.887 |
| 228 | 13644.726 | 10472.727 | 20114.951 | 17472.749 | 29600 | 17000.435 | 19133.242 | 10603.426 | 8717.297 | 6599.528 | 7894.792 | 8280.022 | 17786.485 | 12244.823 |
| 229 | 13627.701 | 10465.882 | 20092.377 | 17472.749 | 29600 | 17000.435 | 19110.449 | 10603.426 | 8717.297 | 6592.177 | 7885.082 | 8270.731 | 17765.006 | 12239.785 |
| 230 | 13610.792 | 10459.046 | 20069.952 | 17465.939 | 29600 | 17000.435 | 19087.809 | 10603.426 | 8717.297 | 6584.842 | 7875.395 | 8261.461 | 17743.672 | 12234.773 |
| 231 | 13593.997 | 10452.219 | 20047.673 | 17465.939 | 29600 | 17000.435 | 19065.32 | 10603.426 | 8717.297 | 6577.523 | 7865.732 | 8252.211 | 17722.481 | 12229.787 |
| 232 | 13577.316 | 10445.401 | 20025.539 | 17459.135 | 29600 | 17000.435 | 19042.98 | 10603.426 | 8717.297 | 6570.221 | 7856.092 | 8242.982 | 17701.431 | 12224.826 |
| 233 | 13560.747 | 10438.592 | 20003.549 | 17459.135 | 29600 | 17000.435 | 19020.788 | 10603.426 | 8717.297 | 6563.028 | 7846.477 | 8233.774 | 17680.521 | 12219.891 |
| 234 | 13544.288 | 10431.792 | 19981.7 | 17452.336 | 29600 | 17000.435 | 18998.742 | 10603.426 | 8717.297 | 6555.851 | 7836.884 | 8224.586 | 17659.749 | 12214.98 |
| 235 | 13527.94 | 10425 | 19959.991 | 17452.336 | 29600 | 17000.435 | 18976.84 | 10603.426 | 8717.297 | 6548.689 | 7827.316 | 8215.419 | 17639.114 | 12210.095 |
| 236 | 13511.699 | 10418.217 | 19938.421 | 17445.543 | 29600 | 17000.435 | 18955.081 | 10603.426 | 8717.297 | 6541.636 | 7817.77 | 8206.272 | 17618.614 | 12205.234 |
| 237 | 13495.566 | 10411.443 | 19916.988 | 17445.543 | 29600 | 17000.435 | 18933.464 | 10603.426 | 8717.297 | 6534.598 | 7808.248 | 8198.665 | 17598.248 | 12200.397 |
| 238 | 13479.538 | 10404.678 | 19895.691 | 17438.755 | 29600 | 17000.435 | 18911.985 | 10603.426 | 8717.297 | 6527.575 | 7798.749 | 8189.556 | 17578.013 | 12195.584 |
| 239 | 13463.615 | 10397.922 | 19874.528 | 17438.755 | 29600 | 17000.435 | 18890.645 | 10603.426 | 8717.297 | 6520.659 | 7789.273 | 8180.466 | 17557.91 | 12190.795 |
| 240 | 13447.796 | 10391.175 | 19853.497 | 17431.972 | 29600 | 17000.435 | 18888.834 | 10603.426 | 8717.297 | 6513.85 | 7781.169 | 8171.397 | 17537.935 | 12186.03 |
| 241 | 13432.079 | 10384.436 | 19832.598 | 17431.972 | 29600 | 17000.435 | 18887.031 | 10603.426 | 8717.297 | 6506.964 | 7771.735 | 8163.855 | 17518.089 | 12181.288 |
| 242 | 13416.464 | 10377.706 | 19811.828 | 17425.194 | 29600 | 17000.435 | 18885.236 | 10603.426 | 8717.297 | 6500.092 | 7762.325 | 8154.822 | 17498.368 | 12176.57 |
| 243 | 13400.948 | 10370.984 | 19791.187 | 17425.194 | 29600 | 17000.435 | 18883.448 | 10603.426 | 8717.297 | 6493.325 | 7752.937 | 8145.81 | 17478.773 | 12171.874 |
| 244 | 13385.532 | 10364.272 | 19770.673 | 17418.422 | 29600 | 17000.435 | 18881.668 | 10603.426 | 8717.297 | 6486.664 | 7744.909 | 8138.314 | 17459.302 | 12167.202 |
| 245 | 13370.213 | 10357.568 | 19750.285 | 17418.422 | 29600 | 17000.435 | 18879.896 | 10603.426 | 8717.297 | 6479.926 | 7735.563 | 8129.338 | 17439.953 | 12162.551 |
| 246 | 13354.992 | 10350.873 | 19730.022 | 17411.655 | 29600 | 17000.435 | 18878.131 | 10603.426 | 8717.297 | 6473.292 | 7726.24 | 8121.873 | 17420.725 | 12157.924 |
| 247 | 13339.867 | 10344.186 | 19709.881 | 17411.655 | 29600 | 17000.435 | 18876.374 | 10603.426 | 8717.297 | 6466.672 | 7718.266 | 8112.933 | 17401.617 | 12153.318 |
| 248 | 13324.836 | 10337.508 | 19689.863 | 17404.893 | 29600 | 17000.435 | 18874.624 | 10603.426 | 8717.297 | 6460.066 | 7708.985 | 8104.013 | 17382.627 | 12148.735 |
| 249 | 13309.899 | 10330.839 | 19669.965 | 17404.893 | 29600 | 17000.435 | 18872.881 | 10603.426 | 8717.297 | 6453.653 | 7701.047 | 8096.595 | 17363.755 | 12144.173 |
| 250 | 13295.055 | 10324.178 | 19650.186 | 17398.137 | 29600 | 17000.435 | 18871.146 | 10603.426 | 8717.297 | 6447.073 | 7691.807 | 8087.71 | 17344.998 | 12139.633 |
| 251 | 13280.303 | 10317.526 | 19630.526 | 17398.137 | 29600 | 17000.435 | 18869.418 | 10603.426 | 8717.297 | 6440.597 | 7683.904 | 8080.322 | 17326.357 | 12135.114 |
| 252 | 13265.642 | 10310.882 | 19610.983 | 17391.385 | 29600 | 17000.435 | 18867.697 | 10603.426 | 8717.297 | 6434.223 | 7674.705 | 8072.946 | 17307.829 | 12130.617 |
| 253 | 13251.071 | 10304.247 | 19591.555 | 17391.385 | 29600 | 17000.435 | 18865.983 | 10603.426 | 8717.297 | 6427.772 | 7666.838 | 8064.114 | 17289.413 | 12126.14 |
| 254 | 13236.589 | 10297.621 | 19572.242 | 17384.639 | 29600 | 17000.435 | 18864.276 | 10603.426 | 8717.297 | 6421.512 | 7657.679 | 8056.768 | 17271.109 | 12121.685 |
| 255 | 13222.196 | 10291.003 | 19553.042 | 17384.639 | 29600 | 17000.435 | 18862.576 | 10603.426 | 8717.297 | 6415.265 | 7649.847 | 8047.971 | 17252.915 | 12117.25 |
| 256 | 13207.889 | 10284.393 | 19533.954 | 17377.898 | 29600 | 17000.435 | 18860.883 | 10603.426 | 8717.297 | 6408.941 | 7640.729 | 8040.655 | 17234.83 | 12112.835 |
| 257 | 13193.668 | 10277.792 | 19514.978 | 17377.898 | 29600 | 17000.435 | 18859.197 | 10603.426 | 8717.297 | 6402.719 | 7632.931 | 8033.351 | 17216.853 | 12108.441 |
| 258 | 13179.534 | 10271.199 | 19496.112 | 17371.163 | 29600 | 17000.435 | 18857.518 | 10603.426 | 8717.297 | 6396.597 | 7625.149 | 8024.605 | 17198.983 | 12104.068 |
| 259 | 13165.483 | 10264.615 | 19477.354 | 17371.163 | 29600 | 17000.435 | 18855.845 | 10603.426 | 8717.297 | 6390.398 | 7616.09 | 8017.331 | 17181.218 | 12099.714 |
| 260 | 13151.516 | 10258.04 | 19458.705 | 17364.432 | 29600 | 17000.435 | 18854.18 | 10603.426 | 8717.297 | 6384.299 | 7608.342 | 8010.071 | 17163.558 | 12095.38 |
| 261 | 13137.633 | 10251.472 | 19440.162 | 17364.432 | 29600 | 17000.435 | 18852.521 | 10603.426 | 8717.297 | 6378.213 | 7600.61 | 8001.375 | 17146.001 | 12091.065 |
| 262 | 13123.831 | 10244.914 | 19421.725 | 17357.707 | 29600 | 17000.435 | 18850.868 | 10603.426 | 8717.297 | 6372.137 | 7591.609 | 7994.143 | 17128.547 | 12086.771 |
| 263 | 13110.11 | 10238.363 | 19403.393 | 17357.707 | 29600 | 17000.435 | 18849.222 | 10603.426 | 8717.297 | 6366.074 | 7583.911 | 7986.924 | 17111.195 | 12082.495 |
| 264 | 13096.47 | 10231.821 | 19385.164 | 17350.987 | 29600 | 17000.435 | 18847.583 | 10603.426 | 8717.297 | 6360.109 | 7576.228 | 7979.719 | 17093.943 | 12078.239 |
| 265 | 13082.909 | 10225.287 | 19367.038 | 17350.987 | 29600 | 17000.435 | 18845.95 | 10603.426 | 8717.297 | 6354.243 | 7568.561 | 7972.526 | 17076.791 | 12074.001 |
| 266 | 13069.427 | 10218.762 | 19349.014 | 17344.272 | 29600 | 17000.435 | 18844.323 | 10603.426 | 8717.297 | 6348.301 | 7560.91 | 7963.911 | 17059.737 | 12069.783 |
| 267 | 13056.023 | 10212.245 | 19331.09 | 17344.272 | 29600 | 17000.435 | 18842.703 | 10603.426 | 8717.297 | 6342.457 | 7553.274 | 7956.747 | 17042.781 | 12065.583 |
| 268 | 13042.696 | 10205.736 | 19313.267 | 17337.563 | 29600 | 17000.435 | 18841.089 | 10603.426 | 8717.297 | 6336.536 | 7544.385 | 7949.596 | 17025.922 | 12061.402 |
| 269 | 13029.446 | 10199.236 | 19295.542 | 17337.563 | 29600 | 17000.435 | 18839.482 | 10603.426 | 8717.297 | 6330.714 | 7536.782 | 7942.457 | 17009.158 | 12057.239 |
| 270 | 13016.272 | 10192.743 | 19277.914 | 17330.858 | 29600 | 17000.435 | 18837.88 | 10603.426 | 8717.297 | 6324.902 | 7529.195 | 7935.331 | 16992.489 | 12053.095 |
| 271 | 13003.172 | 10186.26 | 19260.384 | 17330.858 | 29600 | 17000.435 | 18836.285 | 10603.426 | 8717.297 | 6319.187 | 7521.623 | 7928.218 | 16975.914 | 12048.968 |
| 272 | 12990.147 | 10179.784 | 19242.95 | 17330.858 | 29600 | 17000.435 | 18834.696 | 10603.426 | 8717.297 | 6313.483 | 7514.066 | 7921.118 | 16959.431 | 12044.86 |
| 273 | 12977.195 | 10173.316 | 19225.611 | 17324.159 | 29600 | 17000.435 | 18833.113 | 10603.426 | 8717.297 | 6307.789 | 7506.524 | 7914.03 | 16943.041 | 12040.769 |
| 274 | 12964.316 | 10166.857 | 19208.366 | 17324.159 | 29600 | 17000.435 | 18831.536 | 10603.426 | 8717.297 | 6302.105 | 7498.997 | 7906.955 | 16926.742 | 12036.696 |
| 275 | 12951.51 | 10160.406 | 19191.214 | 17317.465 | 29600 | 17000.435 | 18829.965 | 10603.426 | 8717.297 | 6296.518 | 7491.486 | 7899.893 | 16910.534 | 12032.64 |
| 276 | 12938.774 | 10153.963 | 19174.155 | 17317.465 | 29600 | 17000.435 | 18828.4 | 10603.426 | 8717.297 | 6290.854 | 7483.989 | 7892.843 | 16894.414 | 12028.602 |
| 277 | 12926.11 | 10147.529 | 19157.188 | 17310.776 | 29600 | 17000.435 | 18826.841 | 10603.426 | 8717.297 | 6285.286 | 7477.754 | 7885.806 | 16878.384 | 12024.581 |
| 278 | 12913.516 | 10141.102 | 19140.311 | 17310.776 | 29600 | 17000.435 | 18825.287 | 10603.426 | 8717.297 | 6279.814 | 7470.285 | 7878.781 | 16862.441 | 12020.577 |
| 279 | 12900.991 | 10134.684 | 19123.524 | 17304.093 | 29600 | 17000.435 | 18823.74 | 10603.426 | 8717.297 | 6274.351 | 7462.831 | 7871.769 | 16846.585 | 12016.591 |
| 280 | 12888.535 | 10128.273 | 19106.827 | 17304.093 | 29600 | 17000.435 | 18822.198 | 10603.426 | 8717.297 | 6268.812 | 7455.391 | 7864.77 | 16830.815 | 12012.621 |
| 281 | 12876.147 | 10121.871 | 19090.217 | 17304.093 | 29600 | 17000.435 | 18820.662 | 10603.426 | 8717.297 | 6263.369 | 7447.967 | 7857.783 | 16815.131 | 12008.667 |
| 282 | 12863.826 | 10115.477 | 19073.696 | 17297.414 | 29600 | 17000.435 | 18819.132 | 10603.426 | 8717.297 | 6257.934 | 7440.557 | 7850.808 | 16799.531 | 12004.731 |
| 283 | 12851.573 | 10109.091 | 19057.26 | 17297.414 | 29600 | 17000.435 | 18817.607 | 10603.426 | 8717.297 | 6252.509 | 7434.394 | 7843.845 | 16784.016 | 12000.81 |
| 284 | 12839.385 | 10102.713 | 19040.911 | 17290.741 | 29600 | 17000.435 | 18816.088 | 10603.426 | 8717.297 | 6247.178 | 7427.011 | 7838.284 | 16768.583 | 11996.906 |
| 285 | 12827.264 | 10096.343 | 19024.647 | 17290.741 | 29600 | 17000.435 | 18814.575 | 10603.426 | 8717.297 | 6241.856 | 7419.643 | 7831.344 | 16753.232 | 11993.019 |
| 286 | 12815.207 | 10089.981 | 19008.467 | 17284.073 | 29600 | 17000.435 | 18813.067 | 10603.426 | 8717.297 | 6236.543 | 7412.289 | 7824.416 | 16737.963 | 11989.147 |
| 287 | 12803.215 | 10083.627 | 18992.371 | 17284.073 | 29600 | 17000.435 | 18811.564 | 10603.426 | 8717.297 | 6231.324 | 7406.173 | 7817.5 | 16722.774 | 11985.291 |
| 288 | 12791.287 | 10077.281 | 18976.358 | 17277.409 | 29600 | 17000.435 | 18810.067 | 10603.426 | 8717.297 | 6226.029 | 7398.846 | 7810.597 | 16707.666 | 11981.452 |
| 289 | 12779.422 | 10070.943 | 18960.427 | 17277.409 | 29600 | 17000.435 | 18808.576 | 10603.426 | 8717.297 | 6220.743 | 7391.534 | 7805.083 | 16692.637 | 11977.627 |
| 290 | 12767.62 | 10064.613 | 18944.577 | 17277.409 | 29600 | 17000.435 | 18807.089 | 10603.426 | 8717.297 | 6215.633 | 7385.451 | 7798.201 | 16677.687 | 11973.819 |
| 291 | 12755.879 | 10058.291 | 18928.808 | 17270.751 | 29600 | 17000.435 | 18805.608 | 10603.426 | 8717.297 | 6210.448 | 7378.165 | 7791.332 | 16662.814 | 11970.026 |
| 292 | 12744.201 | 10051.977 | 18913.12 | 17270.751 | 29600 | 17000.435 | 18804.133 | 10603.426 | 8717.297 | 6205.272 | 7370.894 | 7784.475 | 16648.019 | 11966.248 |
| 293 | 12732.584 | 10045.671 | 18897.51 | 17264.099 | 29600 | 17000.435 | 18802.662 | 10603.426 | 8717.297 | 6200.188 | 7364.845 | 7778.997 | 16633.3 | 11962.486 |
| 294 | 12721.027 | 10039.373 | 18881.979 | 17264.099 | 29600 | 17000.435 | 18801.197 | 10603.426 | 8717.297 | 6195.029 | 7357.6 | 7772.162 | 16618.657 | 11958.738 |
| 295 | 12709.53 | 10033.083 | 18866.526 | 17257.451 | 29600 | 17000.435 | 18799.737 | 10603.426 | 8717.297 | 6190.045 | 7351.573 | 7765.338 | 16604.09 | 11955.006 |
| 296 | 12698.092 | 10026.8 | 18851.15 | 17257.451 | 29600 | 17000.435 | 18798.283 | 10603.426 | 8717.297 | 6184.902 | 7344.354 | 7759.888 | 16589.596 | 11951.289 |
| 297 | 12686.714 | 10020.526 | 18835.851 | 17257.451 | 29600 | 17000.435 | 18796.833 | 10603.426 | 8717.297 | 6179.934 | 7338.348 | 7753.086 | 16575.177 | 11947.586 |
| 298 | 12675.393 | 10014.259 | 18820.628 | 17250.808 | 29600 | 17000.435 | 18795.388 | 10603.426 | 8717.297 | 6174.891 | 7331.155 | 7746.295 | 16560.831 | 11943.898 |
| 299 | 12664.131 | 10008 | 18805.48 | 17250.808 | 29600 | 17000.435 | 18793.949 | 10603.426 | 8717.297 | 6169.939 | 7325.171 | 7740.872 | 16546.557 | 11940.225 |